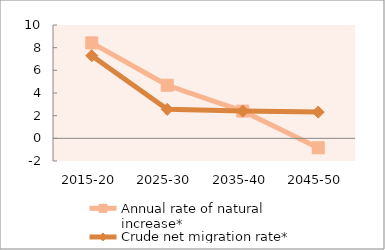
| Category | Annual rate of natural increase* | Crude net migration rate* |
|---|---|---|
| 2015-20 | 8.422 | 7.291 |
| 2025-30 | 4.684 | 2.558 |
| 2035-40 | 2.404 | 2.401 |
| 2045-50 | -0.831 | 2.315 |